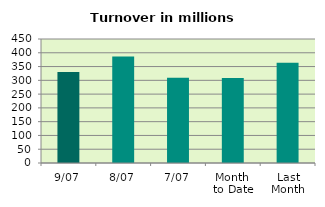
| Category | Series 0 |
|---|---|
| 9/07 | 330.446 |
| 8/07 | 386.506 |
| 7/07 | 309.004 |
| Month 
to Date | 308.743 |
| Last
Month | 364.182 |